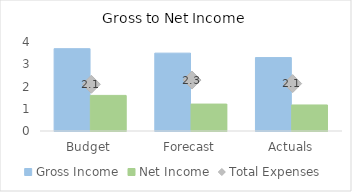
| Category | Gross Income | Net Income |
|---|---|---|
| Budget | 3.7 | 1.6 |
| Forecast | 3.5 | 1.21 |
| Actuals | 3.3 | 1.17 |